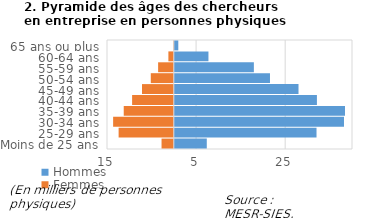
| Category | Hommes | Femmes |
|---|---|---|
| Moins de 25 ans | 7.401 | -2.756 |
| 25-29 ans | 32.035 | -12.392 |
| 30-34 ans | 38.203 | -13.624 |
| 35-39 ans | 38.428 | -11.243 |
| 40-44 ans | 32.124 | -9.363 |
| 45-49 ans | 27.992 | -7.142 |
| 50-54 ans | 21.588 | -5.171 |
| 55-59 ans | 17.97 | -3.525 |
| 60-64 ans | 7.774 | -1.219 |
| 65 ans ou plus | 1.006 | -0.12 |